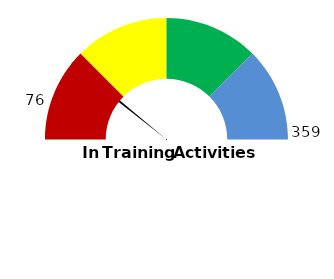
| Category | Series 1 |
|---|---|
| 0 | 21.17 |
| 1 | 1 |
| 2 | 177.83 |